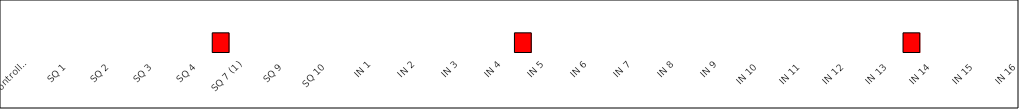
| Category | Series 0 |
|---|---|
| controllo DOT. ORG. | 0 |
| SQ 1 | 0 |
| SQ 2 | 0 |
| SQ 3 | 0 |
| SQ 4 | 0 |
| SQ 7 (1) | 1 |
| SQ 9 | 0 |
| SQ 10 | 0 |
| IN 1 | 0 |
| IN 2 | 0 |
| IN 3 | 0 |
| IN 4 | 0 |
| IN 5 | 1 |
| IN 6 | 0 |
| IN 7 | 0 |
| IN 8 | 0 |
| IN 9 | 0 |
| IN 10 | 0 |
| IN 11 | 0 |
| IN 12 | 0 |
| IN 13 | 0 |
| IN 14 | 1 |
| IN 15 | 0 |
| IN 16 | 0 |